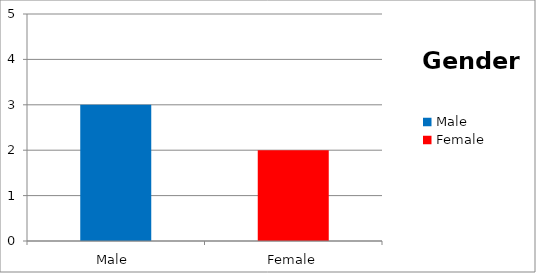
| Category | Series 0 |
|---|---|
| Male  | 3 |
| Female | 2 |